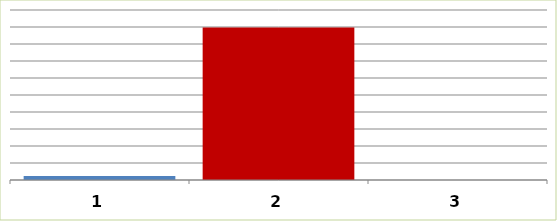
| Category | Series 0 |
|---|---|
| 0 | 48500 |
| 1 | 1793825 |
| 2 | 0 |